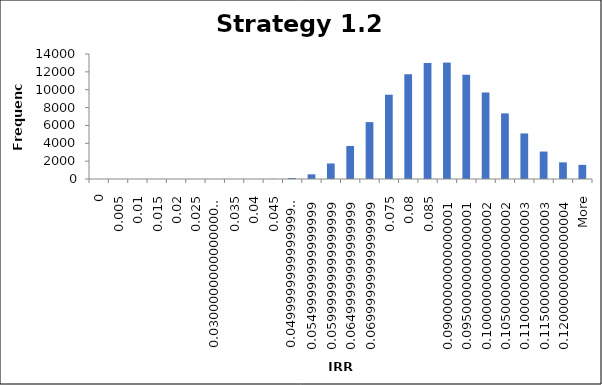
| Category | Frequency |
|---|---|
| 0 | 0 |
| 0.005 | 0 |
| 0.01 | 0 |
| 0.015 | 0 |
| 0.02 | 0 |
| 0.025 | 0 |
| 0.03 | 2 |
| 0.035 | 1 |
| 0.04 | 0 |
| 0.045 | 16 |
| 0.05 | 114 |
| 0.055 | 524 |
| 0.06 | 1740 |
| 0.065 | 3701 |
| 0.07 | 6369 |
| 0.075 | 9440 |
| 0.08 | 11728 |
| 0.085 | 12989 |
| 0.09 | 13037 |
| 0.095 | 11673 |
| 0.1 | 9696 |
| 0.105 | 7349 |
| 0.11 | 5103 |
| 0.115 | 3074 |
| 0.12 | 1861 |
| More | 1585 |